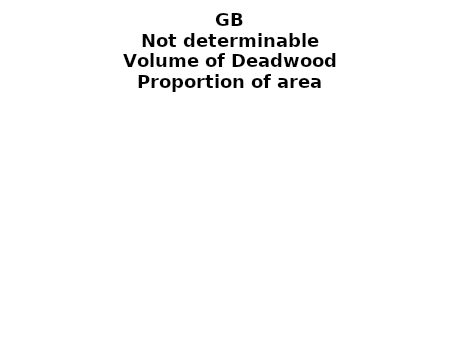
| Category | Not determinable |
|---|---|
|  None | 0.002 |
| >0 and ≤ 10 | 0.001 |
| >10 and ≤ 20  | 0.001 |
| >20 and ≤ 30  | 0.001 |
| >30 and ≤ 40  | 0.001 |
| >40 and ≤ 50  | 0 |
| >50 and ≤ 60  | 0 |
| >60 and ≤ 70  | 0 |
| >70 and ≤ 80  | 0 |
| >80 and ≤ 90  | 0 |
| >90 and ≤ 100  | 0 |
| >100 and ≤ 150 | 0 |
| >150 and ≤ 200  | 0 |
| >200 and ≤ 500 | 0 |
| >500   | 0 |